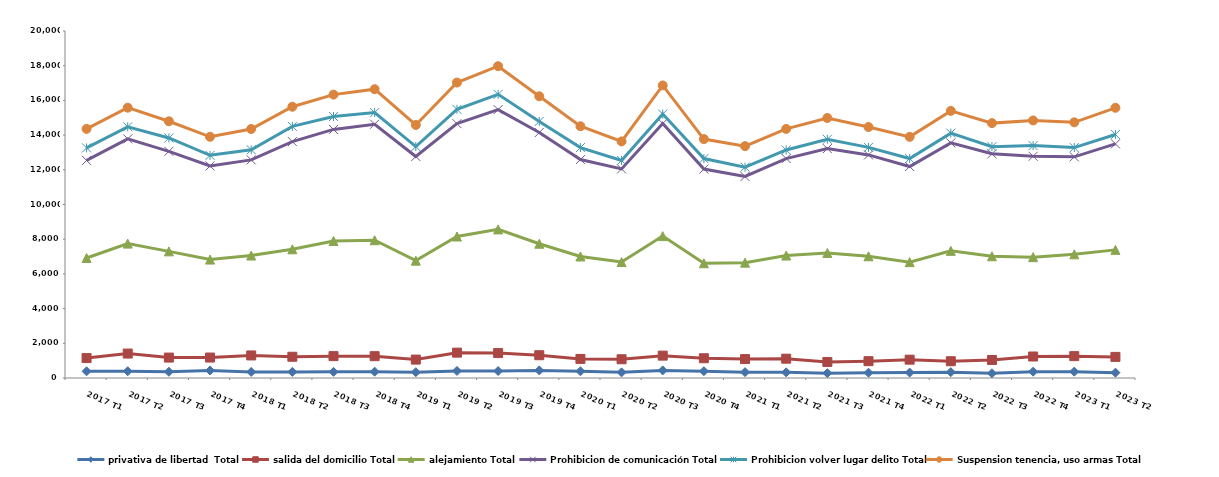
| Category | privativa de libertad  Total | salida del domicilio Total | alejamiento Total | Prohibicion de comunicación Total | Prohibicion volver lugar delito Total | Suspension tenencia, uso armas Total |
|---|---|---|---|---|---|---|
| 2017 T1 | 385 | 763 | 5769 | 5625 | 720 | 1097 |
| 2017 T2 | 389 | 1020 | 6337 | 6036 | 695 | 1103 |
| 2017 T3 | 360 | 817 | 6122 | 5765 | 770 | 963 |
| 2017 T4 | 432 | 747 | 5646 | 5399 | 610 | 1069 |
| 2018 T1 | 350 | 950 | 5758 | 5513 | 585 | 1196 |
| 2018 T2 | 352 | 872 | 6194 | 6206 | 877 | 1133 |
| 2018 T3 | 354 | 906 | 6638 | 6430 | 743 | 1263 |
| 2018 T4 | 364 | 894 | 6685 | 6685 | 670 | 1349 |
| 2019 T1 | 334 | 727 | 5704 | 6003 | 573 | 1243 |
| 2019 T2 | 406 | 1055 | 6694 | 6504 | 827 | 1543 |
| 2019 T3 | 401 | 1035 | 7130 | 6902 | 880 | 1624 |
| 2019 T4 | 437 | 876 | 6426 | 6409 | 640 | 1450 |
| 2020 T1 | 387 | 713 | 5904 | 5586 | 692 | 1228 |
| 2020 T2 | 325 | 755 | 5603 | 5367 | 488 | 1099 |
| 2020 T3 | 437 | 852 | 6890 | 6487 | 545 | 1652 |
| 2020 T4 | 395 | 744 | 5474 | 5429 | 606 | 1122 |
| 2021 T1 | 336 | 755 | 5558 | 4967 | 536 | 1211 |
| 2021 T2 | 326 | 788 | 5945 | 5586 | 497 | 1215 |
| 2021 T3 | 279 | 645 | 6283 | 6015 | 538 | 1226 |
| 2021 T4 | 306 | 664 | 6045 | 5843 | 435 | 1173 |
| 2022 T1 | 313 | 744 | 5621 | 5510 | 462 | 1249 |
| 2022 T2 | 335 | 632 | 6361 | 6222 | 564 | 1282 |
| 2022 T3 | 273 | 765 | 5978 | 5905 | 411 | 1359 |
| 2022 T4 | 364 | 875 | 5727 | 5814 | 614 | 1450 |
| 2023 T1 | 366 | 894 | 5868 | 5618 | 533 | 1458 |
| 2023 T2 | 307 | 910 | 6168 | 6110 | 538 | 1541 |